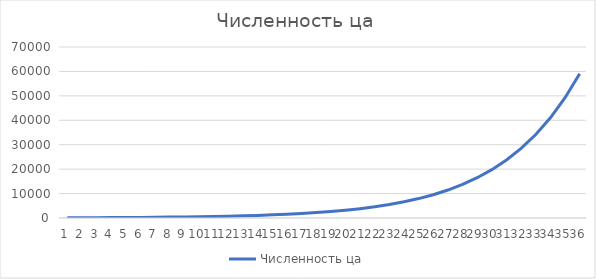
| Category | Численность ца |
|---|---|
| 0 | 100 |
| 1 | 120 |
| 2 | 144 |
| 3 | 172.8 |
| 4 | 207.36 |
| 5 | 248.832 |
| 6 | 298.598 |
| 7 | 358.318 |
| 8 | 429.982 |
| 9 | 515.978 |
| 10 | 619.174 |
| 11 | 743.008 |
| 12 | 891.61 |
| 13 | 1069.932 |
| 14 | 1283.918 |
| 15 | 1540.702 |
| 16 | 1848.843 |
| 17 | 2218.611 |
| 18 | 2662.333 |
| 19 | 3194.8 |
| 20 | 3833.76 |
| 21 | 4600.512 |
| 22 | 5520.614 |
| 23 | 6624.737 |
| 24 | 7949.685 |
| 25 | 9539.622 |
| 26 | 11447.546 |
| 27 | 13737.055 |
| 28 | 16484.466 |
| 29 | 19781.359 |
| 30 | 23737.631 |
| 31 | 28485.158 |
| 32 | 34182.189 |
| 33 | 41018.627 |
| 34 | 49222.352 |
| 35 | 59066.823 |